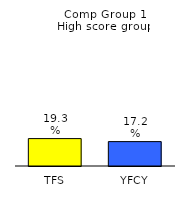
| Category | Series 0 |
|---|---|
| TFS | 0.193 |
| YFCY | 0.172 |